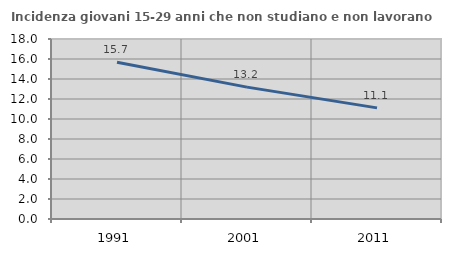
| Category | Incidenza giovani 15-29 anni che non studiano e non lavorano  |
|---|---|
| 1991.0 | 15.669 |
| 2001.0 | 13.187 |
| 2011.0 | 11.111 |